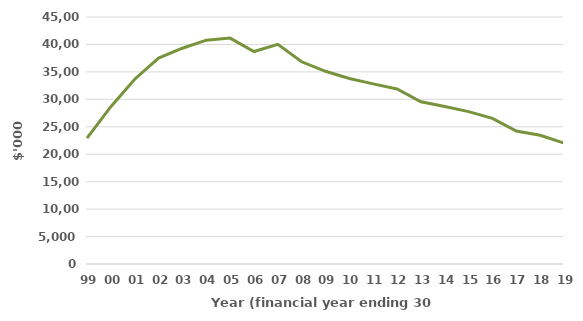
| Category | Net gambling revenue ($'000)a |
|---|---|
| 99 | 22926.089 |
| 00 | 28660.15 |
| 01 | 33669.93 |
| 02 | 37521.553 |
| 03 | 39311.197 |
| 04 | 40780.758 |
| 05 | 41160.91 |
| 06 | 38710.341 |
| 07 | 40020.325 |
| 08 | 36838.675 |
| 09 | 35112.065 |
| 10 | 33805.416 |
| 11 | 32815.062 |
| 12 | 31893.482 |
| 13 | 29543.798 |
| 14 | 28684.769 |
| 15 | 27754.69 |
| 16 | 26527.94 |
| 17 | 24221.672 |
| 18 | 23460.276 |
| 19 | 22031.142 |